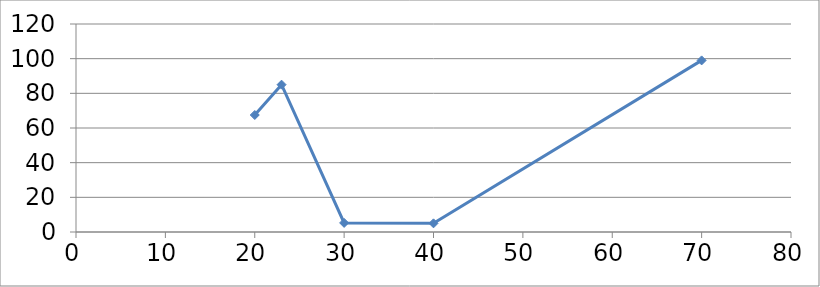
| Category | Series 0 |
|---|---|
| 20.0 | 67.5 |
| 23.0 | 85 |
| 30.0 | 5.25 |
| 40.0 | 5 |
| 70.0 | 99 |